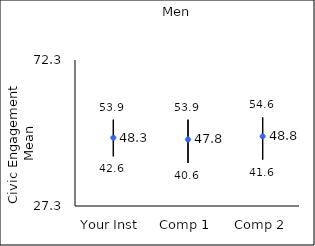
| Category | 25th percentile | 75th percentile | Mean |
|---|---|---|---|
| Your Inst | 42.6 | 53.9 | 48.34 |
| Comp 1 | 40.6 | 53.9 | 47.8 |
| Comp 2 | 41.6 | 54.6 | 48.76 |